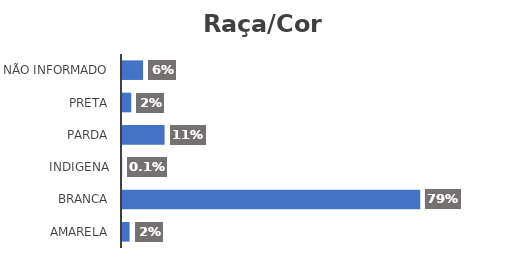
| Category | Series 0 |
|---|---|
| Amarela | 0.02 |
| Branca | 0.787 |
| Indigena | 0.001 |
| Parda | 0.112 |
| Preta | 0.024 |
| Não Informado | 0.056 |